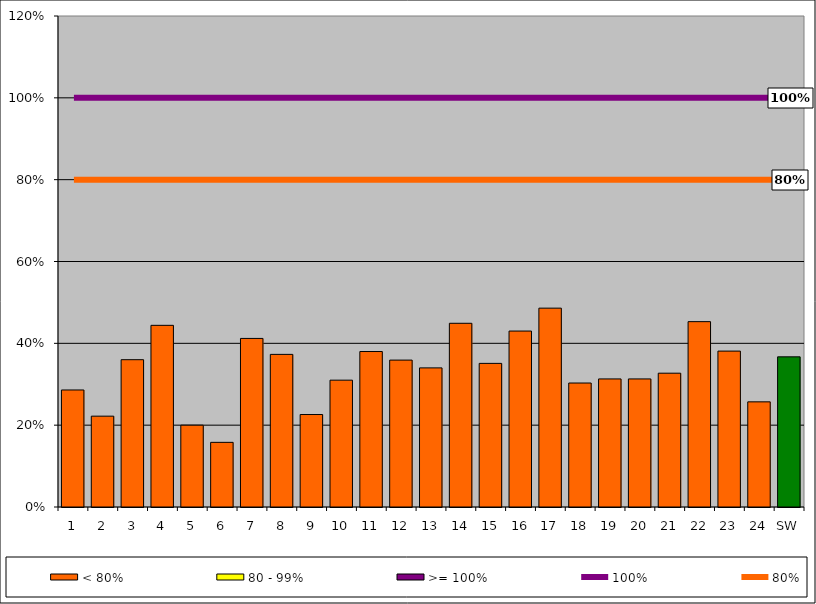
| Category | < 80% | 80 - 99% | >= 100% |
|---|---|---|---|
| 1 | 0.286 | 0 | 0 |
| 2 | 0.222 | 0 | 0 |
| 3 | 0.36 | 0 | 0 |
| 4 | 0.444 | 0 | 0 |
| 5 | 0.2 | 0 | 0 |
| 6 | 0.158 | 0 | 0 |
| 7 | 0.412 | 0 | 0 |
| 8 | 0.373 | 0 | 0 |
| 9 | 0.226 | 0 | 0 |
| 10 | 0.31 | 0 | 0 |
| 11 | 0.38 | 0 | 0 |
| 12 | 0.359 | 0 | 0 |
| 13 | 0.34 | 0 | 0 |
| 14 | 0.449 | 0 | 0 |
| 15 | 0.351 | 0 | 0 |
| 16 | 0.43 | 0 | 0 |
| 17 | 0.486 | 0 | 0 |
| 18 | 0.303 | 0 | 0 |
| 19 | 0.313 | 0 | 0 |
| 20 | 0.313 | 0 | 0 |
| 21 | 0.327 | 0 | 0 |
| 22 | 0.453 | 0 | 0 |
| 23 | 0.381 | 0 | 0 |
| 24 | 0.257 | 0 | 0 |
| SW | 0.367 | 0 | 0 |